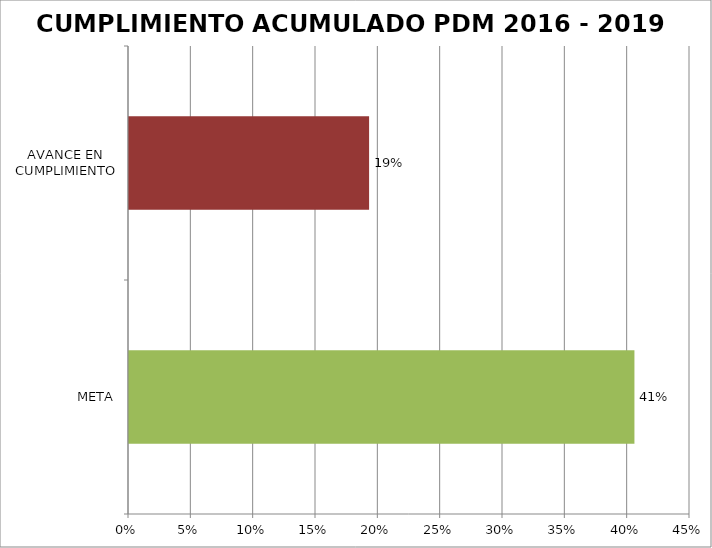
| Category | Series 0 |
|---|---|
| META | 0.405 |
| AVANCE EN CUMPLIMIENTO | 0.193 |